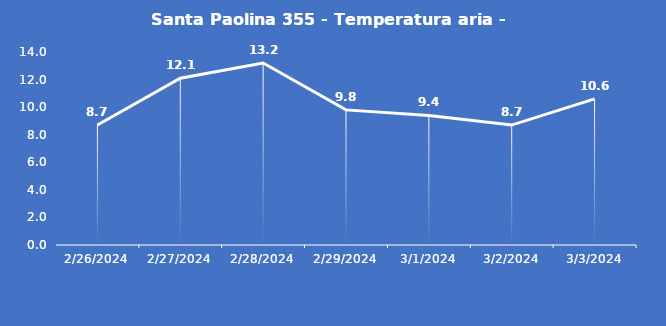
| Category | Santa Paolina 355 - Temperatura aria - Grezzo (°C) |
|---|---|
| 2/26/24 | 8.7 |
| 2/27/24 | 12.1 |
| 2/28/24 | 13.2 |
| 2/29/24 | 9.8 |
| 3/1/24 | 9.4 |
| 3/2/24 | 8.7 |
| 3/3/24 | 10.6 |